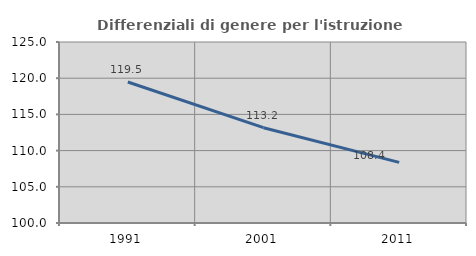
| Category | Differenziali di genere per l'istruzione superiore |
|---|---|
| 1991.0 | 119.476 |
| 2001.0 | 113.165 |
| 2011.0 | 108.368 |